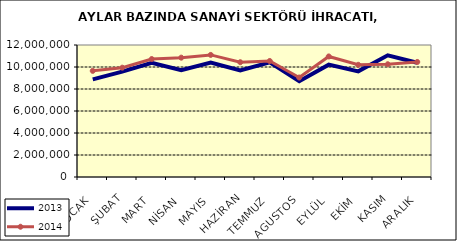
| Category | 2013 | 2014 |
|---|---|---|
| OCAK | 8872224.447 | 9649323.994 |
| ŞUBAT | 9579901.937 | 9937798.593 |
| MART | 10385140.266 | 10722644.739 |
| NİSAN | 9708564.746 | 10849546.505 |
| MAYIS | 10398926.977 | 11098300.999 |
| HAZİRAN | 9681915.902 | 10434429.414 |
| TEMMUZ | 10421301.653 | 10546399.696 |
| AGUSTOS | 8712913.533 | 9043433.961 |
| EYLÜL | 10212670.532 | 10958881.629 |
| EKİM | 9606638.167 | 10199590.822 |
| KASIM | 11061002.299 | 10250083.255 |
| ARALIK | 10380872.876 | 10456824.271 |